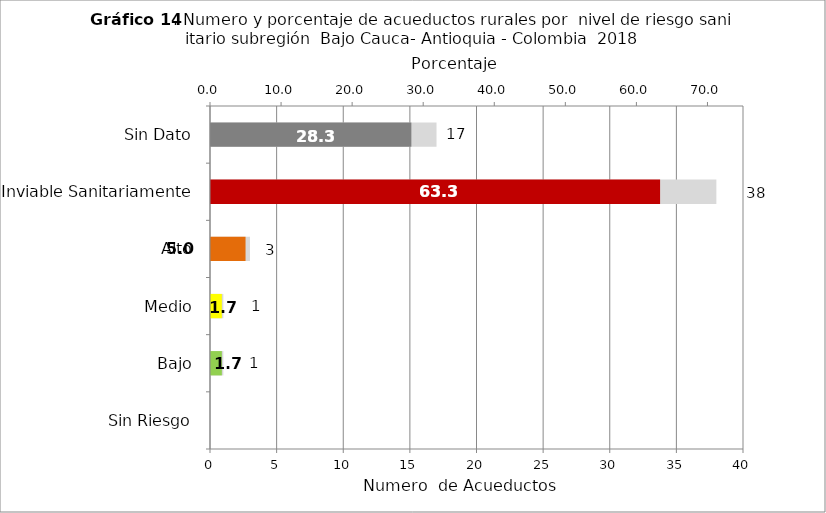
| Category | Número de Sistemas |
|---|---|
| Sin Riesgo | 0 |
| Bajo | 1 |
| Medio | 1 |
| Alto | 3 |
| Inviable Sanitariamente | 38 |
| Sin Dato | 17 |